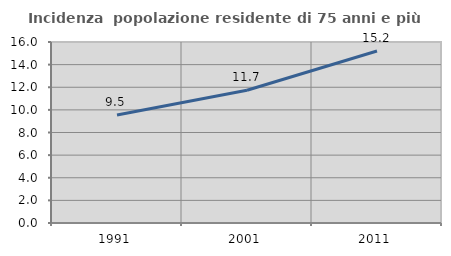
| Category | Incidenza  popolazione residente di 75 anni e più |
|---|---|
| 1991.0 | 9.549 |
| 2001.0 | 11.733 |
| 2011.0 | 15.207 |